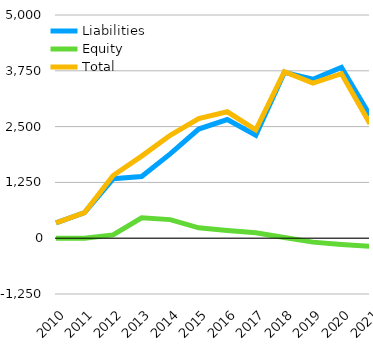
| Category | Liabilities  | Equity  | Total  |
|---|---|---|---|
| 2010 | 342 | 0 | 342 |
| 2011 | 575 | 0 | 575 |
| 2012 | 1331 | 73 | 1404 |
| 2013 | 1381 | 458 | 1839 |
| 2014 | 1889 | 416 | 2305 |
| 2015 | 2446 | 232 | 2678 |
| 2016 | 2658 | 174 | 2832 |
| 2017 | 2306 | 122 | 2428 |
| 2018 | 3714 | 17 | 3731 |
| 2019 | 3561 | -88 | 3473 |
| 2020 | 3826 | -140 | 3686 |
| 2021 | 2750 | -183.6 | 2566.4 |